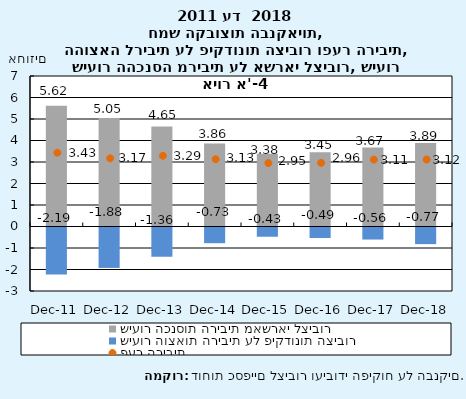
| Category | שיעור הכנסות הריבית מאשראי לציבור | שיעור הוצאות הריבית על פיקדונות הציבור |
|---|---|---|
| 2011-12-31 | 5.62 | -2.19 |
| 2012-12-31 | 5.05 | -1.88 |
| 2013-12-31 | 4.65 | -1.36 |
| 2014-12-31 | 3.86 | -0.73 |
| 2015-12-31 | 3.38 | -0.43 |
| 2016-12-31 | 3.45 | -0.49 |
| 2017-12-31 | 3.67 | -0.56 |
| 2018-12-31 | 3.889 | -0.773 |